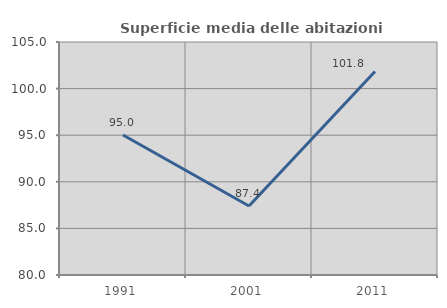
| Category | Superficie media delle abitazioni occupate |
|---|---|
| 1991.0 | 95.024 |
| 2001.0 | 87.404 |
| 2011.0 | 101.833 |